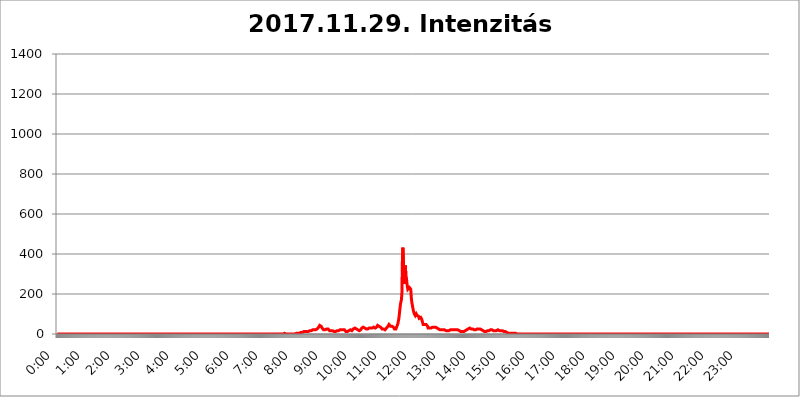
| Category | 2017.11.29. Intenzitás [W/m^2] |
|---|---|
| 0.0 | 0 |
| 0.0006944444444444445 | 0 |
| 0.001388888888888889 | 0 |
| 0.0020833333333333333 | 0 |
| 0.002777777777777778 | 0 |
| 0.003472222222222222 | 0 |
| 0.004166666666666667 | 0 |
| 0.004861111111111111 | 0 |
| 0.005555555555555556 | 0 |
| 0.0062499999999999995 | 0 |
| 0.006944444444444444 | 0 |
| 0.007638888888888889 | 0 |
| 0.008333333333333333 | 0 |
| 0.009027777777777779 | 0 |
| 0.009722222222222222 | 0 |
| 0.010416666666666666 | 0 |
| 0.011111111111111112 | 0 |
| 0.011805555555555555 | 0 |
| 0.012499999999999999 | 0 |
| 0.013194444444444444 | 0 |
| 0.013888888888888888 | 0 |
| 0.014583333333333332 | 0 |
| 0.015277777777777777 | 0 |
| 0.015972222222222224 | 0 |
| 0.016666666666666666 | 0 |
| 0.017361111111111112 | 0 |
| 0.018055555555555557 | 0 |
| 0.01875 | 0 |
| 0.019444444444444445 | 0 |
| 0.02013888888888889 | 0 |
| 0.020833333333333332 | 0 |
| 0.02152777777777778 | 0 |
| 0.022222222222222223 | 0 |
| 0.02291666666666667 | 0 |
| 0.02361111111111111 | 0 |
| 0.024305555555555556 | 0 |
| 0.024999999999999998 | 0 |
| 0.025694444444444447 | 0 |
| 0.02638888888888889 | 0 |
| 0.027083333333333334 | 0 |
| 0.027777777777777776 | 0 |
| 0.02847222222222222 | 0 |
| 0.029166666666666664 | 0 |
| 0.029861111111111113 | 0 |
| 0.030555555555555555 | 0 |
| 0.03125 | 0 |
| 0.03194444444444445 | 0 |
| 0.03263888888888889 | 0 |
| 0.03333333333333333 | 0 |
| 0.034027777777777775 | 0 |
| 0.034722222222222224 | 0 |
| 0.035416666666666666 | 0 |
| 0.036111111111111115 | 0 |
| 0.03680555555555556 | 0 |
| 0.0375 | 0 |
| 0.03819444444444444 | 0 |
| 0.03888888888888889 | 0 |
| 0.03958333333333333 | 0 |
| 0.04027777777777778 | 0 |
| 0.04097222222222222 | 0 |
| 0.041666666666666664 | 0 |
| 0.042361111111111106 | 0 |
| 0.04305555555555556 | 0 |
| 0.043750000000000004 | 0 |
| 0.044444444444444446 | 0 |
| 0.04513888888888889 | 0 |
| 0.04583333333333334 | 0 |
| 0.04652777777777778 | 0 |
| 0.04722222222222222 | 0 |
| 0.04791666666666666 | 0 |
| 0.04861111111111111 | 0 |
| 0.049305555555555554 | 0 |
| 0.049999999999999996 | 0 |
| 0.05069444444444445 | 0 |
| 0.051388888888888894 | 0 |
| 0.052083333333333336 | 0 |
| 0.05277777777777778 | 0 |
| 0.05347222222222222 | 0 |
| 0.05416666666666667 | 0 |
| 0.05486111111111111 | 0 |
| 0.05555555555555555 | 0 |
| 0.05625 | 0 |
| 0.05694444444444444 | 0 |
| 0.057638888888888885 | 0 |
| 0.05833333333333333 | 0 |
| 0.05902777777777778 | 0 |
| 0.059722222222222225 | 0 |
| 0.06041666666666667 | 0 |
| 0.061111111111111116 | 0 |
| 0.06180555555555556 | 0 |
| 0.0625 | 0 |
| 0.06319444444444444 | 0 |
| 0.06388888888888888 | 0 |
| 0.06458333333333334 | 0 |
| 0.06527777777777778 | 0 |
| 0.06597222222222222 | 0 |
| 0.06666666666666667 | 0 |
| 0.06736111111111111 | 0 |
| 0.06805555555555555 | 0 |
| 0.06874999999999999 | 0 |
| 0.06944444444444443 | 0 |
| 0.07013888888888889 | 0 |
| 0.07083333333333333 | 0 |
| 0.07152777777777779 | 0 |
| 0.07222222222222223 | 0 |
| 0.07291666666666667 | 0 |
| 0.07361111111111111 | 0 |
| 0.07430555555555556 | 0 |
| 0.075 | 0 |
| 0.07569444444444444 | 0 |
| 0.0763888888888889 | 0 |
| 0.07708333333333334 | 0 |
| 0.07777777777777778 | 0 |
| 0.07847222222222222 | 0 |
| 0.07916666666666666 | 0 |
| 0.0798611111111111 | 0 |
| 0.08055555555555556 | 0 |
| 0.08125 | 0 |
| 0.08194444444444444 | 0 |
| 0.08263888888888889 | 0 |
| 0.08333333333333333 | 0 |
| 0.08402777777777777 | 0 |
| 0.08472222222222221 | 0 |
| 0.08541666666666665 | 0 |
| 0.08611111111111112 | 0 |
| 0.08680555555555557 | 0 |
| 0.08750000000000001 | 0 |
| 0.08819444444444445 | 0 |
| 0.08888888888888889 | 0 |
| 0.08958333333333333 | 0 |
| 0.09027777777777778 | 0 |
| 0.09097222222222222 | 0 |
| 0.09166666666666667 | 0 |
| 0.09236111111111112 | 0 |
| 0.09305555555555556 | 0 |
| 0.09375 | 0 |
| 0.09444444444444444 | 0 |
| 0.09513888888888888 | 0 |
| 0.09583333333333333 | 0 |
| 0.09652777777777777 | 0 |
| 0.09722222222222222 | 0 |
| 0.09791666666666667 | 0 |
| 0.09861111111111111 | 0 |
| 0.09930555555555555 | 0 |
| 0.09999999999999999 | 0 |
| 0.10069444444444443 | 0 |
| 0.1013888888888889 | 0 |
| 0.10208333333333335 | 0 |
| 0.10277777777777779 | 0 |
| 0.10347222222222223 | 0 |
| 0.10416666666666667 | 0 |
| 0.10486111111111111 | 0 |
| 0.10555555555555556 | 0 |
| 0.10625 | 0 |
| 0.10694444444444444 | 0 |
| 0.1076388888888889 | 0 |
| 0.10833333333333334 | 0 |
| 0.10902777777777778 | 0 |
| 0.10972222222222222 | 0 |
| 0.1111111111111111 | 0 |
| 0.11180555555555556 | 0 |
| 0.11180555555555556 | 0 |
| 0.1125 | 0 |
| 0.11319444444444444 | 0 |
| 0.11388888888888889 | 0 |
| 0.11458333333333333 | 0 |
| 0.11527777777777777 | 0 |
| 0.11597222222222221 | 0 |
| 0.11666666666666665 | 0 |
| 0.1173611111111111 | 0 |
| 0.11805555555555557 | 0 |
| 0.11944444444444445 | 0 |
| 0.12013888888888889 | 0 |
| 0.12083333333333333 | 0 |
| 0.12152777777777778 | 0 |
| 0.12222222222222223 | 0 |
| 0.12291666666666667 | 0 |
| 0.12291666666666667 | 0 |
| 0.12361111111111112 | 0 |
| 0.12430555555555556 | 0 |
| 0.125 | 0 |
| 0.12569444444444444 | 0 |
| 0.12638888888888888 | 0 |
| 0.12708333333333333 | 0 |
| 0.16875 | 0 |
| 0.12847222222222224 | 0 |
| 0.12916666666666668 | 0 |
| 0.12986111111111112 | 0 |
| 0.13055555555555556 | 0 |
| 0.13125 | 0 |
| 0.13194444444444445 | 0 |
| 0.1326388888888889 | 0 |
| 0.13333333333333333 | 0 |
| 0.13402777777777777 | 0 |
| 0.13402777777777777 | 0 |
| 0.13472222222222222 | 0 |
| 0.13541666666666666 | 0 |
| 0.1361111111111111 | 0 |
| 0.13749999999999998 | 0 |
| 0.13819444444444443 | 0 |
| 0.1388888888888889 | 0 |
| 0.13958333333333334 | 0 |
| 0.14027777777777778 | 0 |
| 0.14097222222222222 | 0 |
| 0.14166666666666666 | 0 |
| 0.1423611111111111 | 0 |
| 0.14305555555555557 | 0 |
| 0.14375000000000002 | 0 |
| 0.14444444444444446 | 0 |
| 0.1451388888888889 | 0 |
| 0.1451388888888889 | 0 |
| 0.14652777777777778 | 0 |
| 0.14722222222222223 | 0 |
| 0.14791666666666667 | 0 |
| 0.1486111111111111 | 0 |
| 0.14930555555555555 | 0 |
| 0.15 | 0 |
| 0.15069444444444444 | 0 |
| 0.15138888888888888 | 0 |
| 0.15208333333333332 | 0 |
| 0.15277777777777776 | 0 |
| 0.15347222222222223 | 0 |
| 0.15416666666666667 | 0 |
| 0.15486111111111112 | 0 |
| 0.15555555555555556 | 0 |
| 0.15625 | 0 |
| 0.15694444444444444 | 0 |
| 0.15763888888888888 | 0 |
| 0.15833333333333333 | 0 |
| 0.15902777777777777 | 0 |
| 0.15972222222222224 | 0 |
| 0.16041666666666668 | 0 |
| 0.16111111111111112 | 0 |
| 0.16180555555555556 | 0 |
| 0.1625 | 0 |
| 0.16319444444444445 | 0 |
| 0.1638888888888889 | 0 |
| 0.16458333333333333 | 0 |
| 0.16527777777777777 | 0 |
| 0.16597222222222222 | 0 |
| 0.16666666666666666 | 0 |
| 0.1673611111111111 | 0 |
| 0.16805555555555554 | 0 |
| 0.16874999999999998 | 0 |
| 0.16944444444444443 | 0 |
| 0.17013888888888887 | 0 |
| 0.1708333333333333 | 0 |
| 0.17152777777777775 | 0 |
| 0.17222222222222225 | 0 |
| 0.1729166666666667 | 0 |
| 0.17361111111111113 | 0 |
| 0.17430555555555557 | 0 |
| 0.17500000000000002 | 0 |
| 0.17569444444444446 | 0 |
| 0.1763888888888889 | 0 |
| 0.17708333333333334 | 0 |
| 0.17777777777777778 | 0 |
| 0.17847222222222223 | 0 |
| 0.17916666666666667 | 0 |
| 0.1798611111111111 | 0 |
| 0.18055555555555555 | 0 |
| 0.18125 | 0 |
| 0.18194444444444444 | 0 |
| 0.1826388888888889 | 0 |
| 0.18333333333333335 | 0 |
| 0.1840277777777778 | 0 |
| 0.18472222222222223 | 0 |
| 0.18541666666666667 | 0 |
| 0.18611111111111112 | 0 |
| 0.18680555555555556 | 0 |
| 0.1875 | 0 |
| 0.18819444444444444 | 0 |
| 0.18888888888888888 | 0 |
| 0.18958333333333333 | 0 |
| 0.19027777777777777 | 0 |
| 0.1909722222222222 | 0 |
| 0.19166666666666665 | 0 |
| 0.19236111111111112 | 0 |
| 0.19305555555555554 | 0 |
| 0.19375 | 0 |
| 0.19444444444444445 | 0 |
| 0.1951388888888889 | 0 |
| 0.19583333333333333 | 0 |
| 0.19652777777777777 | 0 |
| 0.19722222222222222 | 0 |
| 0.19791666666666666 | 0 |
| 0.1986111111111111 | 0 |
| 0.19930555555555554 | 0 |
| 0.19999999999999998 | 0 |
| 0.20069444444444443 | 0 |
| 0.20138888888888887 | 0 |
| 0.2020833333333333 | 0 |
| 0.2027777777777778 | 0 |
| 0.2034722222222222 | 0 |
| 0.2041666666666667 | 0 |
| 0.20486111111111113 | 0 |
| 0.20555555555555557 | 0 |
| 0.20625000000000002 | 0 |
| 0.20694444444444446 | 0 |
| 0.2076388888888889 | 0 |
| 0.20833333333333334 | 0 |
| 0.20902777777777778 | 0 |
| 0.20972222222222223 | 0 |
| 0.21041666666666667 | 0 |
| 0.2111111111111111 | 0 |
| 0.21180555555555555 | 0 |
| 0.2125 | 0 |
| 0.21319444444444444 | 0 |
| 0.2138888888888889 | 0 |
| 0.21458333333333335 | 0 |
| 0.2152777777777778 | 0 |
| 0.21597222222222223 | 0 |
| 0.21666666666666667 | 0 |
| 0.21736111111111112 | 0 |
| 0.21805555555555556 | 0 |
| 0.21875 | 0 |
| 0.21944444444444444 | 0 |
| 0.22013888888888888 | 0 |
| 0.22083333333333333 | 0 |
| 0.22152777777777777 | 0 |
| 0.2222222222222222 | 0 |
| 0.22291666666666665 | 0 |
| 0.2236111111111111 | 0 |
| 0.22430555555555556 | 0 |
| 0.225 | 0 |
| 0.22569444444444445 | 0 |
| 0.2263888888888889 | 0 |
| 0.22708333333333333 | 0 |
| 0.22777777777777777 | 0 |
| 0.22847222222222222 | 0 |
| 0.22916666666666666 | 0 |
| 0.2298611111111111 | 0 |
| 0.23055555555555554 | 0 |
| 0.23124999999999998 | 0 |
| 0.23194444444444443 | 0 |
| 0.23263888888888887 | 0 |
| 0.2333333333333333 | 0 |
| 0.2340277777777778 | 0 |
| 0.2347222222222222 | 0 |
| 0.2354166666666667 | 0 |
| 0.23611111111111113 | 0 |
| 0.23680555555555557 | 0 |
| 0.23750000000000002 | 0 |
| 0.23819444444444446 | 0 |
| 0.2388888888888889 | 0 |
| 0.23958333333333334 | 0 |
| 0.24027777777777778 | 0 |
| 0.24097222222222223 | 0 |
| 0.24166666666666667 | 0 |
| 0.2423611111111111 | 0 |
| 0.24305555555555555 | 0 |
| 0.24375 | 0 |
| 0.24444444444444446 | 0 |
| 0.24513888888888888 | 0 |
| 0.24583333333333335 | 0 |
| 0.2465277777777778 | 0 |
| 0.24722222222222223 | 0 |
| 0.24791666666666667 | 0 |
| 0.24861111111111112 | 0 |
| 0.24930555555555556 | 0 |
| 0.25 | 0 |
| 0.25069444444444444 | 0 |
| 0.2513888888888889 | 0 |
| 0.2520833333333333 | 0 |
| 0.25277777777777777 | 0 |
| 0.2534722222222222 | 0 |
| 0.25416666666666665 | 0 |
| 0.2548611111111111 | 0 |
| 0.2555555555555556 | 0 |
| 0.25625000000000003 | 0 |
| 0.2569444444444445 | 0 |
| 0.2576388888888889 | 0 |
| 0.25833333333333336 | 0 |
| 0.2590277777777778 | 0 |
| 0.25972222222222224 | 0 |
| 0.2604166666666667 | 0 |
| 0.2611111111111111 | 0 |
| 0.26180555555555557 | 0 |
| 0.2625 | 0 |
| 0.26319444444444445 | 0 |
| 0.2638888888888889 | 0 |
| 0.26458333333333334 | 0 |
| 0.2652777777777778 | 0 |
| 0.2659722222222222 | 0 |
| 0.26666666666666666 | 0 |
| 0.2673611111111111 | 0 |
| 0.26805555555555555 | 0 |
| 0.26875 | 0 |
| 0.26944444444444443 | 0 |
| 0.2701388888888889 | 0 |
| 0.2708333333333333 | 0 |
| 0.27152777777777776 | 0 |
| 0.2722222222222222 | 0 |
| 0.27291666666666664 | 0 |
| 0.2736111111111111 | 0 |
| 0.2743055555555555 | 0 |
| 0.27499999999999997 | 0 |
| 0.27569444444444446 | 0 |
| 0.27638888888888885 | 0 |
| 0.27708333333333335 | 0 |
| 0.2777777777777778 | 0 |
| 0.27847222222222223 | 0 |
| 0.2791666666666667 | 0 |
| 0.2798611111111111 | 0 |
| 0.28055555555555556 | 0 |
| 0.28125 | 0 |
| 0.28194444444444444 | 0 |
| 0.2826388888888889 | 0 |
| 0.2833333333333333 | 0 |
| 0.28402777777777777 | 0 |
| 0.2847222222222222 | 0 |
| 0.28541666666666665 | 0 |
| 0.28611111111111115 | 0 |
| 0.28680555555555554 | 0 |
| 0.28750000000000003 | 0 |
| 0.2881944444444445 | 0 |
| 0.2888888888888889 | 0 |
| 0.28958333333333336 | 0 |
| 0.2902777777777778 | 0 |
| 0.29097222222222224 | 0 |
| 0.2916666666666667 | 0 |
| 0.2923611111111111 | 0 |
| 0.29305555555555557 | 0 |
| 0.29375 | 0 |
| 0.29444444444444445 | 0 |
| 0.2951388888888889 | 0 |
| 0.29583333333333334 | 0 |
| 0.2965277777777778 | 0 |
| 0.2972222222222222 | 0 |
| 0.29791666666666666 | 0 |
| 0.2986111111111111 | 0 |
| 0.29930555555555555 | 0 |
| 0.3 | 0 |
| 0.30069444444444443 | 0 |
| 0.3013888888888889 | 0 |
| 0.3020833333333333 | 0 |
| 0.30277777777777776 | 0 |
| 0.3034722222222222 | 0 |
| 0.30416666666666664 | 0 |
| 0.3048611111111111 | 0 |
| 0.3055555555555555 | 0 |
| 0.30624999999999997 | 0 |
| 0.3069444444444444 | 0 |
| 0.3076388888888889 | 0 |
| 0.30833333333333335 | 0 |
| 0.3090277777777778 | 0 |
| 0.30972222222222223 | 0 |
| 0.3104166666666667 | 0 |
| 0.3111111111111111 | 0 |
| 0.31180555555555556 | 3.525 |
| 0.3125 | 0 |
| 0.31319444444444444 | 0 |
| 0.3138888888888889 | 0 |
| 0.3145833333333333 | 0 |
| 0.31527777777777777 | 0 |
| 0.3159722222222222 | 0 |
| 0.31666666666666665 | 0 |
| 0.31736111111111115 | 3.525 |
| 0.31805555555555554 | 3.525 |
| 0.31875000000000003 | 3.525 |
| 0.3194444444444445 | 3.525 |
| 0.3201388888888889 | 0 |
| 0.32083333333333336 | 0 |
| 0.3215277777777778 | 0 |
| 0.32222222222222224 | 3.525 |
| 0.3229166666666667 | 0 |
| 0.3236111111111111 | 3.525 |
| 0.32430555555555557 | 0 |
| 0.325 | 0 |
| 0.32569444444444445 | 0 |
| 0.3263888888888889 | 0 |
| 0.32708333333333334 | 0 |
| 0.3277777777777778 | 0 |
| 0.3284722222222222 | 0 |
| 0.32916666666666666 | 0 |
| 0.3298611111111111 | 0 |
| 0.33055555555555555 | 0 |
| 0.33125 | 0 |
| 0.33194444444444443 | 0 |
| 0.3326388888888889 | 0 |
| 0.3333333333333333 | 0 |
| 0.3340277777777778 | 0 |
| 0.3347222222222222 | 3.525 |
| 0.3354166666666667 | 3.525 |
| 0.3361111111111111 | 3.525 |
| 0.3368055555555556 | 3.525 |
| 0.33749999999999997 | 3.525 |
| 0.33819444444444446 | 3.525 |
| 0.33888888888888885 | 3.525 |
| 0.33958333333333335 | 3.525 |
| 0.34027777777777773 | 7.887 |
| 0.34097222222222223 | 7.887 |
| 0.3416666666666666 | 7.887 |
| 0.3423611111111111 | 7.887 |
| 0.3430555555555555 | 12.257 |
| 0.34375 | 7.887 |
| 0.3444444444444445 | 12.257 |
| 0.3451388888888889 | 12.257 |
| 0.3458333333333334 | 12.257 |
| 0.34652777777777777 | 12.257 |
| 0.34722222222222227 | 16.636 |
| 0.34791666666666665 | 12.257 |
| 0.34861111111111115 | 12.257 |
| 0.34930555555555554 | 12.257 |
| 0.35000000000000003 | 12.257 |
| 0.3506944444444444 | 12.257 |
| 0.3513888888888889 | 12.257 |
| 0.3520833333333333 | 12.257 |
| 0.3527777777777778 | 12.257 |
| 0.3534722222222222 | 16.636 |
| 0.3541666666666667 | 16.636 |
| 0.3548611111111111 | 16.636 |
| 0.35555555555555557 | 16.636 |
| 0.35625 | 16.636 |
| 0.35694444444444445 | 21.024 |
| 0.3576388888888889 | 21.024 |
| 0.35833333333333334 | 21.024 |
| 0.3590277777777778 | 21.024 |
| 0.3597222222222222 | 21.024 |
| 0.36041666666666666 | 21.024 |
| 0.3611111111111111 | 21.024 |
| 0.36180555555555555 | 21.024 |
| 0.3625 | 21.024 |
| 0.36319444444444443 | 21.024 |
| 0.3638888888888889 | 21.024 |
| 0.3645833333333333 | 25.419 |
| 0.3652777777777778 | 25.419 |
| 0.3659722222222222 | 29.823 |
| 0.3666666666666667 | 34.234 |
| 0.3673611111111111 | 38.653 |
| 0.3680555555555556 | 43.079 |
| 0.36874999999999997 | 43.079 |
| 0.36944444444444446 | 43.079 |
| 0.37013888888888885 | 38.653 |
| 0.37083333333333335 | 34.234 |
| 0.37152777777777773 | 29.823 |
| 0.37222222222222223 | 29.823 |
| 0.3729166666666666 | 25.419 |
| 0.3736111111111111 | 21.024 |
| 0.3743055555555555 | 21.024 |
| 0.375 | 21.024 |
| 0.3756944444444445 | 21.024 |
| 0.3763888888888889 | 25.419 |
| 0.3770833333333334 | 21.024 |
| 0.37777777777777777 | 25.419 |
| 0.37847222222222227 | 25.419 |
| 0.37916666666666665 | 25.419 |
| 0.37986111111111115 | 25.419 |
| 0.38055555555555554 | 21.024 |
| 0.38125000000000003 | 21.024 |
| 0.3819444444444444 | 16.636 |
| 0.3826388888888889 | 16.636 |
| 0.3833333333333333 | 16.636 |
| 0.3840277777777778 | 16.636 |
| 0.3847222222222222 | 16.636 |
| 0.3854166666666667 | 16.636 |
| 0.3861111111111111 | 16.636 |
| 0.38680555555555557 | 16.636 |
| 0.3875 | 12.257 |
| 0.38819444444444445 | 12.257 |
| 0.3888888888888889 | 12.257 |
| 0.38958333333333334 | 12.257 |
| 0.3902777777777778 | 12.257 |
| 0.3909722222222222 | 12.257 |
| 0.39166666666666666 | 12.257 |
| 0.3923611111111111 | 16.636 |
| 0.39305555555555555 | 16.636 |
| 0.39375 | 16.636 |
| 0.39444444444444443 | 16.636 |
| 0.3951388888888889 | 21.024 |
| 0.3958333333333333 | 21.024 |
| 0.3965277777777778 | 21.024 |
| 0.3972222222222222 | 21.024 |
| 0.3979166666666667 | 21.024 |
| 0.3986111111111111 | 21.024 |
| 0.3993055555555556 | 21.024 |
| 0.39999999999999997 | 21.024 |
| 0.40069444444444446 | 21.024 |
| 0.40138888888888885 | 21.024 |
| 0.40208333333333335 | 21.024 |
| 0.40277777777777773 | 21.024 |
| 0.40347222222222223 | 16.636 |
| 0.4041666666666666 | 16.636 |
| 0.4048611111111111 | 12.257 |
| 0.4055555555555555 | 12.257 |
| 0.40625 | 12.257 |
| 0.4069444444444445 | 12.257 |
| 0.4076388888888889 | 12.257 |
| 0.4083333333333334 | 16.636 |
| 0.40902777777777777 | 16.636 |
| 0.40972222222222227 | 16.636 |
| 0.41041666666666665 | 16.636 |
| 0.41111111111111115 | 21.024 |
| 0.41180555555555554 | 16.636 |
| 0.41250000000000003 | 16.636 |
| 0.4131944444444444 | 16.636 |
| 0.4138888888888889 | 21.024 |
| 0.4145833333333333 | 21.024 |
| 0.4152777777777778 | 25.419 |
| 0.4159722222222222 | 25.419 |
| 0.4166666666666667 | 25.419 |
| 0.4173611111111111 | 29.823 |
| 0.41805555555555557 | 29.823 |
| 0.41875 | 25.419 |
| 0.41944444444444445 | 25.419 |
| 0.4201388888888889 | 21.024 |
| 0.42083333333333334 | 21.024 |
| 0.4215277777777778 | 21.024 |
| 0.4222222222222222 | 21.024 |
| 0.42291666666666666 | 21.024 |
| 0.4236111111111111 | 16.636 |
| 0.42430555555555555 | 16.636 |
| 0.425 | 21.024 |
| 0.42569444444444443 | 21.024 |
| 0.4263888888888889 | 25.419 |
| 0.4270833333333333 | 29.823 |
| 0.4277777777777778 | 29.823 |
| 0.4284722222222222 | 34.234 |
| 0.4291666666666667 | 34.234 |
| 0.4298611111111111 | 34.234 |
| 0.4305555555555556 | 34.234 |
| 0.43124999999999997 | 29.823 |
| 0.43194444444444446 | 25.419 |
| 0.43263888888888885 | 25.419 |
| 0.43333333333333335 | 25.419 |
| 0.43402777777777773 | 25.419 |
| 0.43472222222222223 | 25.419 |
| 0.4354166666666666 | 25.419 |
| 0.4361111111111111 | 25.419 |
| 0.4368055555555555 | 29.823 |
| 0.4375 | 29.823 |
| 0.4381944444444445 | 29.823 |
| 0.4388888888888889 | 29.823 |
| 0.4395833333333334 | 29.823 |
| 0.44027777777777777 | 29.823 |
| 0.44097222222222227 | 29.823 |
| 0.44166666666666665 | 29.823 |
| 0.44236111111111115 | 34.234 |
| 0.44305555555555554 | 34.234 |
| 0.44375000000000003 | 34.234 |
| 0.4444444444444444 | 34.234 |
| 0.4451388888888889 | 34.234 |
| 0.4458333333333333 | 29.823 |
| 0.4465277777777778 | 34.234 |
| 0.4472222222222222 | 34.234 |
| 0.4479166666666667 | 34.234 |
| 0.4486111111111111 | 38.653 |
| 0.44930555555555557 | 43.079 |
| 0.45 | 43.079 |
| 0.45069444444444445 | 38.653 |
| 0.4513888888888889 | 38.653 |
| 0.45208333333333334 | 38.653 |
| 0.4527777777777778 | 38.653 |
| 0.4534722222222222 | 34.234 |
| 0.45416666666666666 | 29.823 |
| 0.4548611111111111 | 29.823 |
| 0.45555555555555555 | 25.419 |
| 0.45625 | 25.419 |
| 0.45694444444444443 | 25.419 |
| 0.4576388888888889 | 25.419 |
| 0.4583333333333333 | 21.024 |
| 0.4590277777777778 | 21.024 |
| 0.4597222222222222 | 21.024 |
| 0.4604166666666667 | 25.419 |
| 0.4611111111111111 | 25.419 |
| 0.4618055555555556 | 29.823 |
| 0.46249999999999997 | 29.823 |
| 0.46319444444444446 | 34.234 |
| 0.46388888888888885 | 38.653 |
| 0.46458333333333335 | 43.079 |
| 0.46527777777777773 | 47.511 |
| 0.46597222222222223 | 43.079 |
| 0.4666666666666666 | 43.079 |
| 0.4673611111111111 | 38.653 |
| 0.4680555555555555 | 38.653 |
| 0.46875 | 38.653 |
| 0.4694444444444445 | 38.653 |
| 0.4701388888888889 | 38.653 |
| 0.4708333333333334 | 38.653 |
| 0.47152777777777777 | 34.234 |
| 0.47222222222222227 | 29.823 |
| 0.47291666666666665 | 25.419 |
| 0.47361111111111115 | 21.024 |
| 0.47430555555555554 | 21.024 |
| 0.47500000000000003 | 25.419 |
| 0.4756944444444444 | 29.823 |
| 0.4763888888888889 | 38.653 |
| 0.4770833333333333 | 43.079 |
| 0.4777777777777778 | 51.951 |
| 0.4784722222222222 | 65.31 |
| 0.4791666666666667 | 78.722 |
| 0.4798611111111111 | 101.184 |
| 0.48055555555555557 | 123.758 |
| 0.48125 | 146.423 |
| 0.48194444444444445 | 160.056 |
| 0.4826388888888889 | 169.156 |
| 0.48333333333333334 | 201.058 |
| 0.4840277777777778 | 360.221 |
| 0.4847222222222222 | 431.833 |
| 0.48541666666666666 | 427.39 |
| 0.4861111111111111 | 301.354 |
| 0.48680555555555555 | 251.251 |
| 0.4875 | 251.251 |
| 0.48819444444444443 | 342.162 |
| 0.4888888888888889 | 296.808 |
| 0.4895833333333333 | 283.156 |
| 0.4902777777777778 | 260.373 |
| 0.4909722222222222 | 237.564 |
| 0.4916666666666667 | 223.873 |
| 0.4923611111111111 | 219.309 |
| 0.4930555555555556 | 223.873 |
| 0.49374999999999997 | 233 |
| 0.49444444444444446 | 237.564 |
| 0.49513888888888885 | 237.564 |
| 0.49583333333333335 | 223.873 |
| 0.49652777777777773 | 182.82 |
| 0.49722222222222223 | 160.056 |
| 0.4979166666666666 | 155.509 |
| 0.4986111111111111 | 132.814 |
| 0.4993055555555555 | 119.235 |
| 0.5 | 110.201 |
| 0.5006944444444444 | 101.184 |
| 0.5013888888888889 | 96.682 |
| 0.5020833333333333 | 92.184 |
| 0.5027777777777778 | 92.184 |
| 0.5034722222222222 | 101.184 |
| 0.5041666666666667 | 96.682 |
| 0.5048611111111111 | 92.184 |
| 0.5055555555555555 | 92.184 |
| 0.50625 | 92.184 |
| 0.5069444444444444 | 87.692 |
| 0.5076388888888889 | 78.722 |
| 0.5083333333333333 | 78.722 |
| 0.5090277777777777 | 83.205 |
| 0.5097222222222222 | 83.205 |
| 0.5104166666666666 | 78.722 |
| 0.5111111111111112 | 74.246 |
| 0.5118055555555555 | 65.31 |
| 0.5125000000000001 | 56.398 |
| 0.5131944444444444 | 47.511 |
| 0.513888888888889 | 43.079 |
| 0.5145833333333333 | 47.511 |
| 0.5152777777777778 | 47.511 |
| 0.5159722222222222 | 47.511 |
| 0.5166666666666667 | 47.511 |
| 0.517361111111111 | 47.511 |
| 0.5180555555555556 | 47.511 |
| 0.5187499999999999 | 43.079 |
| 0.5194444444444445 | 38.653 |
| 0.5201388888888888 | 29.823 |
| 0.5208333333333334 | 29.823 |
| 0.5215277777777778 | 29.823 |
| 0.5222222222222223 | 29.823 |
| 0.5229166666666667 | 29.823 |
| 0.5236111111111111 | 29.823 |
| 0.5243055555555556 | 29.823 |
| 0.525 | 29.823 |
| 0.5256944444444445 | 34.234 |
| 0.5263888888888889 | 34.234 |
| 0.5270833333333333 | 34.234 |
| 0.5277777777777778 | 34.234 |
| 0.5284722222222222 | 34.234 |
| 0.5291666666666667 | 34.234 |
| 0.5298611111111111 | 34.234 |
| 0.5305555555555556 | 34.234 |
| 0.53125 | 29.823 |
| 0.5319444444444444 | 29.823 |
| 0.5326388888888889 | 29.823 |
| 0.5333333333333333 | 29.823 |
| 0.5340277777777778 | 29.823 |
| 0.5347222222222222 | 25.419 |
| 0.5354166666666667 | 25.419 |
| 0.5361111111111111 | 25.419 |
| 0.5368055555555555 | 21.024 |
| 0.5375 | 21.024 |
| 0.5381944444444444 | 21.024 |
| 0.5388888888888889 | 21.024 |
| 0.5395833333333333 | 21.024 |
| 0.5402777777777777 | 21.024 |
| 0.5409722222222222 | 21.024 |
| 0.5416666666666666 | 21.024 |
| 0.5423611111111112 | 21.024 |
| 0.5430555555555555 | 21.024 |
| 0.5437500000000001 | 16.636 |
| 0.5444444444444444 | 16.636 |
| 0.545138888888889 | 16.636 |
| 0.5458333333333333 | 16.636 |
| 0.5465277777777778 | 16.636 |
| 0.5472222222222222 | 16.636 |
| 0.5479166666666667 | 16.636 |
| 0.548611111111111 | 16.636 |
| 0.5493055555555556 | 16.636 |
| 0.5499999999999999 | 21.024 |
| 0.5506944444444445 | 21.024 |
| 0.5513888888888888 | 21.024 |
| 0.5520833333333334 | 21.024 |
| 0.5527777777777778 | 21.024 |
| 0.5534722222222223 | 21.024 |
| 0.5541666666666667 | 21.024 |
| 0.5548611111111111 | 21.024 |
| 0.5555555555555556 | 21.024 |
| 0.55625 | 21.024 |
| 0.5569444444444445 | 21.024 |
| 0.5576388888888889 | 21.024 |
| 0.5583333333333333 | 21.024 |
| 0.5590277777777778 | 21.024 |
| 0.5597222222222222 | 21.024 |
| 0.5604166666666667 | 21.024 |
| 0.5611111111111111 | 21.024 |
| 0.5618055555555556 | 21.024 |
| 0.5625 | 21.024 |
| 0.5631944444444444 | 16.636 |
| 0.5638888888888889 | 16.636 |
| 0.5645833333333333 | 16.636 |
| 0.5652777777777778 | 12.257 |
| 0.5659722222222222 | 12.257 |
| 0.5666666666666667 | 12.257 |
| 0.5673611111111111 | 12.257 |
| 0.5680555555555555 | 12.257 |
| 0.56875 | 12.257 |
| 0.5694444444444444 | 12.257 |
| 0.5701388888888889 | 12.257 |
| 0.5708333333333333 | 12.257 |
| 0.5715277777777777 | 12.257 |
| 0.5722222222222222 | 16.636 |
| 0.5729166666666666 | 16.636 |
| 0.5736111111111112 | 21.024 |
| 0.5743055555555555 | 21.024 |
| 0.5750000000000001 | 21.024 |
| 0.5756944444444444 | 25.419 |
| 0.576388888888889 | 25.419 |
| 0.5770833333333333 | 29.823 |
| 0.5777777777777778 | 29.823 |
| 0.5784722222222222 | 29.823 |
| 0.5791666666666667 | 29.823 |
| 0.579861111111111 | 25.419 |
| 0.5805555555555556 | 25.419 |
| 0.5812499999999999 | 25.419 |
| 0.5819444444444445 | 25.419 |
| 0.5826388888888888 | 25.419 |
| 0.5833333333333334 | 21.024 |
| 0.5840277777777778 | 25.419 |
| 0.5847222222222223 | 21.024 |
| 0.5854166666666667 | 21.024 |
| 0.5861111111111111 | 21.024 |
| 0.5868055555555556 | 21.024 |
| 0.5875 | 25.419 |
| 0.5881944444444445 | 25.419 |
| 0.5888888888888889 | 25.419 |
| 0.5895833333333333 | 25.419 |
| 0.5902777777777778 | 25.419 |
| 0.5909722222222222 | 25.419 |
| 0.5916666666666667 | 25.419 |
| 0.5923611111111111 | 25.419 |
| 0.5930555555555556 | 25.419 |
| 0.59375 | 25.419 |
| 0.5944444444444444 | 25.419 |
| 0.5951388888888889 | 21.024 |
| 0.5958333333333333 | 21.024 |
| 0.5965277777777778 | 21.024 |
| 0.5972222222222222 | 16.636 |
| 0.5979166666666667 | 16.636 |
| 0.5986111111111111 | 16.636 |
| 0.5993055555555555 | 12.257 |
| 0.6 | 12.257 |
| 0.6006944444444444 | 12.257 |
| 0.6013888888888889 | 12.257 |
| 0.6020833333333333 | 12.257 |
| 0.6027777777777777 | 12.257 |
| 0.6034722222222222 | 16.636 |
| 0.6041666666666666 | 16.636 |
| 0.6048611111111112 | 16.636 |
| 0.6055555555555555 | 16.636 |
| 0.6062500000000001 | 21.024 |
| 0.6069444444444444 | 21.024 |
| 0.607638888888889 | 21.024 |
| 0.6083333333333333 | 21.024 |
| 0.6090277777777778 | 21.024 |
| 0.6097222222222222 | 21.024 |
| 0.6104166666666667 | 21.024 |
| 0.611111111111111 | 16.636 |
| 0.6118055555555556 | 16.636 |
| 0.6124999999999999 | 16.636 |
| 0.6131944444444445 | 16.636 |
| 0.6138888888888888 | 16.636 |
| 0.6145833333333334 | 16.636 |
| 0.6152777777777778 | 16.636 |
| 0.6159722222222223 | 16.636 |
| 0.6166666666666667 | 21.024 |
| 0.6173611111111111 | 21.024 |
| 0.6180555555555556 | 21.024 |
| 0.61875 | 21.024 |
| 0.6194444444444445 | 21.024 |
| 0.6201388888888889 | 16.636 |
| 0.6208333333333333 | 16.636 |
| 0.6215277777777778 | 16.636 |
| 0.6222222222222222 | 16.636 |
| 0.6229166666666667 | 16.636 |
| 0.6236111111111111 | 12.257 |
| 0.6243055555555556 | 16.636 |
| 0.625 | 12.257 |
| 0.6256944444444444 | 12.257 |
| 0.6263888888888889 | 12.257 |
| 0.6270833333333333 | 12.257 |
| 0.6277777777777778 | 12.257 |
| 0.6284722222222222 | 12.257 |
| 0.6291666666666667 | 7.887 |
| 0.6298611111111111 | 7.887 |
| 0.6305555555555555 | 7.887 |
| 0.63125 | 3.525 |
| 0.6319444444444444 | 3.525 |
| 0.6326388888888889 | 3.525 |
| 0.6333333333333333 | 3.525 |
| 0.6340277777777777 | 3.525 |
| 0.6347222222222222 | 3.525 |
| 0.6354166666666666 | 3.525 |
| 0.6361111111111112 | 3.525 |
| 0.6368055555555555 | 3.525 |
| 0.6375000000000001 | 3.525 |
| 0.6381944444444444 | 3.525 |
| 0.638888888888889 | 3.525 |
| 0.6395833333333333 | 3.525 |
| 0.6402777777777778 | 3.525 |
| 0.6409722222222222 | 3.525 |
| 0.6416666666666667 | 3.525 |
| 0.642361111111111 | 3.525 |
| 0.6430555555555556 | 3.525 |
| 0.6437499999999999 | 0 |
| 0.6444444444444445 | 0 |
| 0.6451388888888888 | 0 |
| 0.6458333333333334 | 0 |
| 0.6465277777777778 | 0 |
| 0.6472222222222223 | 0 |
| 0.6479166666666667 | 0 |
| 0.6486111111111111 | 0 |
| 0.6493055555555556 | 0 |
| 0.65 | 0 |
| 0.6506944444444445 | 0 |
| 0.6513888888888889 | 0 |
| 0.6520833333333333 | 0 |
| 0.6527777777777778 | 0 |
| 0.6534722222222222 | 0 |
| 0.6541666666666667 | 0 |
| 0.6548611111111111 | 0 |
| 0.6555555555555556 | 0 |
| 0.65625 | 0 |
| 0.6569444444444444 | 0 |
| 0.6576388888888889 | 0 |
| 0.6583333333333333 | 0 |
| 0.6590277777777778 | 0 |
| 0.6597222222222222 | 0 |
| 0.6604166666666667 | 0 |
| 0.6611111111111111 | 0 |
| 0.6618055555555555 | 0 |
| 0.6625 | 0 |
| 0.6631944444444444 | 0 |
| 0.6638888888888889 | 0 |
| 0.6645833333333333 | 0 |
| 0.6652777777777777 | 0 |
| 0.6659722222222222 | 0 |
| 0.6666666666666666 | 0 |
| 0.6673611111111111 | 0 |
| 0.6680555555555556 | 0 |
| 0.6687500000000001 | 0 |
| 0.6694444444444444 | 0 |
| 0.6701388888888888 | 0 |
| 0.6708333333333334 | 0 |
| 0.6715277777777778 | 0 |
| 0.6722222222222222 | 0 |
| 0.6729166666666666 | 0 |
| 0.6736111111111112 | 0 |
| 0.6743055555555556 | 0 |
| 0.6749999999999999 | 0 |
| 0.6756944444444444 | 0 |
| 0.6763888888888889 | 0 |
| 0.6770833333333334 | 0 |
| 0.6777777777777777 | 0 |
| 0.6784722222222223 | 0 |
| 0.6791666666666667 | 0 |
| 0.6798611111111111 | 0 |
| 0.6805555555555555 | 0 |
| 0.68125 | 0 |
| 0.6819444444444445 | 0 |
| 0.6826388888888889 | 0 |
| 0.6833333333333332 | 0 |
| 0.6840277777777778 | 0 |
| 0.6847222222222222 | 0 |
| 0.6854166666666667 | 0 |
| 0.686111111111111 | 0 |
| 0.6868055555555556 | 0 |
| 0.6875 | 0 |
| 0.6881944444444444 | 0 |
| 0.688888888888889 | 0 |
| 0.6895833333333333 | 0 |
| 0.6902777777777778 | 0 |
| 0.6909722222222222 | 0 |
| 0.6916666666666668 | 0 |
| 0.6923611111111111 | 0 |
| 0.6930555555555555 | 0 |
| 0.69375 | 0 |
| 0.6944444444444445 | 0 |
| 0.6951388888888889 | 0 |
| 0.6958333333333333 | 0 |
| 0.6965277777777777 | 0 |
| 0.6972222222222223 | 0 |
| 0.6979166666666666 | 0 |
| 0.6986111111111111 | 0 |
| 0.6993055555555556 | 0 |
| 0.7000000000000001 | 0 |
| 0.7006944444444444 | 0 |
| 0.7013888888888888 | 0 |
| 0.7020833333333334 | 0 |
| 0.7027777777777778 | 0 |
| 0.7034722222222222 | 0 |
| 0.7041666666666666 | 0 |
| 0.7048611111111112 | 0 |
| 0.7055555555555556 | 0 |
| 0.7062499999999999 | 0 |
| 0.7069444444444444 | 0 |
| 0.7076388888888889 | 0 |
| 0.7083333333333334 | 0 |
| 0.7090277777777777 | 0 |
| 0.7097222222222223 | 0 |
| 0.7104166666666667 | 0 |
| 0.7111111111111111 | 0 |
| 0.7118055555555555 | 0 |
| 0.7125 | 0 |
| 0.7131944444444445 | 0 |
| 0.7138888888888889 | 0 |
| 0.7145833333333332 | 0 |
| 0.7152777777777778 | 0 |
| 0.7159722222222222 | 0 |
| 0.7166666666666667 | 0 |
| 0.717361111111111 | 0 |
| 0.7180555555555556 | 0 |
| 0.71875 | 0 |
| 0.7194444444444444 | 0 |
| 0.720138888888889 | 0 |
| 0.7208333333333333 | 0 |
| 0.7215277777777778 | 0 |
| 0.7222222222222222 | 0 |
| 0.7229166666666668 | 0 |
| 0.7236111111111111 | 0 |
| 0.7243055555555555 | 0 |
| 0.725 | 0 |
| 0.7256944444444445 | 0 |
| 0.7263888888888889 | 0 |
| 0.7270833333333333 | 0 |
| 0.7277777777777777 | 0 |
| 0.7284722222222223 | 0 |
| 0.7291666666666666 | 0 |
| 0.7298611111111111 | 0 |
| 0.7305555555555556 | 0 |
| 0.7312500000000001 | 0 |
| 0.7319444444444444 | 0 |
| 0.7326388888888888 | 0 |
| 0.7333333333333334 | 0 |
| 0.7340277777777778 | 0 |
| 0.7347222222222222 | 0 |
| 0.7354166666666666 | 0 |
| 0.7361111111111112 | 0 |
| 0.7368055555555556 | 0 |
| 0.7374999999999999 | 0 |
| 0.7381944444444444 | 0 |
| 0.7388888888888889 | 0 |
| 0.7395833333333334 | 0 |
| 0.7402777777777777 | 0 |
| 0.7409722222222223 | 0 |
| 0.7416666666666667 | 0 |
| 0.7423611111111111 | 0 |
| 0.7430555555555555 | 0 |
| 0.74375 | 0 |
| 0.7444444444444445 | 0 |
| 0.7451388888888889 | 0 |
| 0.7458333333333332 | 0 |
| 0.7465277777777778 | 0 |
| 0.7472222222222222 | 0 |
| 0.7479166666666667 | 0 |
| 0.748611111111111 | 0 |
| 0.7493055555555556 | 0 |
| 0.75 | 0 |
| 0.7506944444444444 | 0 |
| 0.751388888888889 | 0 |
| 0.7520833333333333 | 0 |
| 0.7527777777777778 | 0 |
| 0.7534722222222222 | 0 |
| 0.7541666666666668 | 0 |
| 0.7548611111111111 | 0 |
| 0.7555555555555555 | 0 |
| 0.75625 | 0 |
| 0.7569444444444445 | 0 |
| 0.7576388888888889 | 0 |
| 0.7583333333333333 | 0 |
| 0.7590277777777777 | 0 |
| 0.7597222222222223 | 0 |
| 0.7604166666666666 | 0 |
| 0.7611111111111111 | 0 |
| 0.7618055555555556 | 0 |
| 0.7625000000000001 | 0 |
| 0.7631944444444444 | 0 |
| 0.7638888888888888 | 0 |
| 0.7645833333333334 | 0 |
| 0.7652777777777778 | 0 |
| 0.7659722222222222 | 0 |
| 0.7666666666666666 | 0 |
| 0.7673611111111112 | 0 |
| 0.7680555555555556 | 0 |
| 0.7687499999999999 | 0 |
| 0.7694444444444444 | 0 |
| 0.7701388888888889 | 0 |
| 0.7708333333333334 | 0 |
| 0.7715277777777777 | 0 |
| 0.7722222222222223 | 0 |
| 0.7729166666666667 | 0 |
| 0.7736111111111111 | 0 |
| 0.7743055555555555 | 0 |
| 0.775 | 0 |
| 0.7756944444444445 | 0 |
| 0.7763888888888889 | 0 |
| 0.7770833333333332 | 0 |
| 0.7777777777777778 | 0 |
| 0.7784722222222222 | 0 |
| 0.7791666666666667 | 0 |
| 0.779861111111111 | 0 |
| 0.7805555555555556 | 0 |
| 0.78125 | 0 |
| 0.7819444444444444 | 0 |
| 0.782638888888889 | 0 |
| 0.7833333333333333 | 0 |
| 0.7840277777777778 | 0 |
| 0.7847222222222222 | 0 |
| 0.7854166666666668 | 0 |
| 0.7861111111111111 | 0 |
| 0.7868055555555555 | 0 |
| 0.7875 | 0 |
| 0.7881944444444445 | 0 |
| 0.7888888888888889 | 0 |
| 0.7895833333333333 | 0 |
| 0.7902777777777777 | 0 |
| 0.7909722222222223 | 0 |
| 0.7916666666666666 | 0 |
| 0.7923611111111111 | 0 |
| 0.7930555555555556 | 0 |
| 0.7937500000000001 | 0 |
| 0.7944444444444444 | 0 |
| 0.7951388888888888 | 0 |
| 0.7958333333333334 | 0 |
| 0.7965277777777778 | 0 |
| 0.7972222222222222 | 0 |
| 0.7979166666666666 | 0 |
| 0.7986111111111112 | 0 |
| 0.7993055555555556 | 0 |
| 0.7999999999999999 | 0 |
| 0.8006944444444444 | 0 |
| 0.8013888888888889 | 0 |
| 0.8020833333333334 | 0 |
| 0.8027777777777777 | 0 |
| 0.8034722222222223 | 0 |
| 0.8041666666666667 | 0 |
| 0.8048611111111111 | 0 |
| 0.8055555555555555 | 0 |
| 0.80625 | 0 |
| 0.8069444444444445 | 0 |
| 0.8076388888888889 | 0 |
| 0.8083333333333332 | 0 |
| 0.8090277777777778 | 0 |
| 0.8097222222222222 | 0 |
| 0.8104166666666667 | 0 |
| 0.811111111111111 | 0 |
| 0.8118055555555556 | 0 |
| 0.8125 | 0 |
| 0.8131944444444444 | 0 |
| 0.813888888888889 | 0 |
| 0.8145833333333333 | 0 |
| 0.8152777777777778 | 0 |
| 0.8159722222222222 | 0 |
| 0.8166666666666668 | 0 |
| 0.8173611111111111 | 0 |
| 0.8180555555555555 | 0 |
| 0.81875 | 0 |
| 0.8194444444444445 | 0 |
| 0.8201388888888889 | 0 |
| 0.8208333333333333 | 0 |
| 0.8215277777777777 | 0 |
| 0.8222222222222223 | 0 |
| 0.8229166666666666 | 0 |
| 0.8236111111111111 | 0 |
| 0.8243055555555556 | 0 |
| 0.8250000000000001 | 0 |
| 0.8256944444444444 | 0 |
| 0.8263888888888888 | 0 |
| 0.8270833333333334 | 0 |
| 0.8277777777777778 | 0 |
| 0.8284722222222222 | 0 |
| 0.8291666666666666 | 0 |
| 0.8298611111111112 | 0 |
| 0.8305555555555556 | 0 |
| 0.8312499999999999 | 0 |
| 0.8319444444444444 | 0 |
| 0.8326388888888889 | 0 |
| 0.8333333333333334 | 0 |
| 0.8340277777777777 | 0 |
| 0.8347222222222223 | 0 |
| 0.8354166666666667 | 0 |
| 0.8361111111111111 | 0 |
| 0.8368055555555555 | 0 |
| 0.8375 | 0 |
| 0.8381944444444445 | 0 |
| 0.8388888888888889 | 0 |
| 0.8395833333333332 | 0 |
| 0.8402777777777778 | 0 |
| 0.8409722222222222 | 0 |
| 0.8416666666666667 | 0 |
| 0.842361111111111 | 0 |
| 0.8430555555555556 | 0 |
| 0.84375 | 0 |
| 0.8444444444444444 | 0 |
| 0.845138888888889 | 0 |
| 0.8458333333333333 | 0 |
| 0.8465277777777778 | 0 |
| 0.8472222222222222 | 0 |
| 0.8479166666666668 | 0 |
| 0.8486111111111111 | 0 |
| 0.8493055555555555 | 0 |
| 0.85 | 0 |
| 0.8506944444444445 | 0 |
| 0.8513888888888889 | 0 |
| 0.8520833333333333 | 0 |
| 0.8527777777777777 | 0 |
| 0.8534722222222223 | 0 |
| 0.8541666666666666 | 0 |
| 0.8548611111111111 | 0 |
| 0.8555555555555556 | 0 |
| 0.8562500000000001 | 0 |
| 0.8569444444444444 | 0 |
| 0.8576388888888888 | 0 |
| 0.8583333333333334 | 0 |
| 0.8590277777777778 | 0 |
| 0.8597222222222222 | 0 |
| 0.8604166666666666 | 0 |
| 0.8611111111111112 | 0 |
| 0.8618055555555556 | 0 |
| 0.8624999999999999 | 0 |
| 0.8631944444444444 | 0 |
| 0.8638888888888889 | 0 |
| 0.8645833333333334 | 0 |
| 0.8652777777777777 | 0 |
| 0.8659722222222223 | 0 |
| 0.8666666666666667 | 0 |
| 0.8673611111111111 | 0 |
| 0.8680555555555555 | 0 |
| 0.86875 | 0 |
| 0.8694444444444445 | 0 |
| 0.8701388888888889 | 0 |
| 0.8708333333333332 | 0 |
| 0.8715277777777778 | 0 |
| 0.8722222222222222 | 0 |
| 0.8729166666666667 | 0 |
| 0.873611111111111 | 0 |
| 0.8743055555555556 | 0 |
| 0.875 | 0 |
| 0.8756944444444444 | 0 |
| 0.876388888888889 | 0 |
| 0.8770833333333333 | 0 |
| 0.8777777777777778 | 0 |
| 0.8784722222222222 | 0 |
| 0.8791666666666668 | 0 |
| 0.8798611111111111 | 0 |
| 0.8805555555555555 | 0 |
| 0.88125 | 0 |
| 0.8819444444444445 | 0 |
| 0.8826388888888889 | 0 |
| 0.8833333333333333 | 0 |
| 0.8840277777777777 | 0 |
| 0.8847222222222223 | 0 |
| 0.8854166666666666 | 0 |
| 0.8861111111111111 | 0 |
| 0.8868055555555556 | 0 |
| 0.8875000000000001 | 0 |
| 0.8881944444444444 | 0 |
| 0.8888888888888888 | 0 |
| 0.8895833333333334 | 0 |
| 0.8902777777777778 | 0 |
| 0.8909722222222222 | 0 |
| 0.8916666666666666 | 0 |
| 0.8923611111111112 | 0 |
| 0.8930555555555556 | 0 |
| 0.8937499999999999 | 0 |
| 0.8944444444444444 | 0 |
| 0.8951388888888889 | 0 |
| 0.8958333333333334 | 0 |
| 0.8965277777777777 | 0 |
| 0.8972222222222223 | 0 |
| 0.8979166666666667 | 0 |
| 0.8986111111111111 | 0 |
| 0.8993055555555555 | 0 |
| 0.9 | 0 |
| 0.9006944444444445 | 0 |
| 0.9013888888888889 | 0 |
| 0.9020833333333332 | 0 |
| 0.9027777777777778 | 0 |
| 0.9034722222222222 | 0 |
| 0.9041666666666667 | 0 |
| 0.904861111111111 | 0 |
| 0.9055555555555556 | 0 |
| 0.90625 | 0 |
| 0.9069444444444444 | 0 |
| 0.907638888888889 | 0 |
| 0.9083333333333333 | 0 |
| 0.9090277777777778 | 0 |
| 0.9097222222222222 | 0 |
| 0.9104166666666668 | 0 |
| 0.9111111111111111 | 0 |
| 0.9118055555555555 | 0 |
| 0.9125 | 0 |
| 0.9131944444444445 | 0 |
| 0.9138888888888889 | 0 |
| 0.9145833333333333 | 0 |
| 0.9152777777777777 | 0 |
| 0.9159722222222223 | 0 |
| 0.9166666666666666 | 0 |
| 0.9173611111111111 | 0 |
| 0.9180555555555556 | 0 |
| 0.9187500000000001 | 0 |
| 0.9194444444444444 | 0 |
| 0.9201388888888888 | 0 |
| 0.9208333333333334 | 0 |
| 0.9215277777777778 | 0 |
| 0.9222222222222222 | 0 |
| 0.9229166666666666 | 0 |
| 0.9236111111111112 | 0 |
| 0.9243055555555556 | 0 |
| 0.9249999999999999 | 0 |
| 0.9256944444444444 | 0 |
| 0.9263888888888889 | 0 |
| 0.9270833333333334 | 0 |
| 0.9277777777777777 | 0 |
| 0.9284722222222223 | 0 |
| 0.9291666666666667 | 0 |
| 0.9298611111111111 | 0 |
| 0.9305555555555555 | 0 |
| 0.93125 | 0 |
| 0.9319444444444445 | 0 |
| 0.9326388888888889 | 0 |
| 0.9333333333333332 | 0 |
| 0.9340277777777778 | 0 |
| 0.9347222222222222 | 0 |
| 0.9354166666666667 | 0 |
| 0.936111111111111 | 0 |
| 0.9368055555555556 | 0 |
| 0.9375 | 0 |
| 0.9381944444444444 | 0 |
| 0.938888888888889 | 0 |
| 0.9395833333333333 | 0 |
| 0.9402777777777778 | 0 |
| 0.9409722222222222 | 0 |
| 0.9416666666666668 | 0 |
| 0.9423611111111111 | 0 |
| 0.9430555555555555 | 0 |
| 0.94375 | 0 |
| 0.9444444444444445 | 0 |
| 0.9451388888888889 | 0 |
| 0.9458333333333333 | 0 |
| 0.9465277777777777 | 0 |
| 0.9472222222222223 | 0 |
| 0.9479166666666666 | 0 |
| 0.9486111111111111 | 0 |
| 0.9493055555555556 | 0 |
| 0.9500000000000001 | 0 |
| 0.9506944444444444 | 0 |
| 0.9513888888888888 | 0 |
| 0.9520833333333334 | 0 |
| 0.9527777777777778 | 0 |
| 0.9534722222222222 | 0 |
| 0.9541666666666666 | 0 |
| 0.9548611111111112 | 0 |
| 0.9555555555555556 | 0 |
| 0.9562499999999999 | 0 |
| 0.9569444444444444 | 0 |
| 0.9576388888888889 | 0 |
| 0.9583333333333334 | 0 |
| 0.9590277777777777 | 0 |
| 0.9597222222222223 | 0 |
| 0.9604166666666667 | 0 |
| 0.9611111111111111 | 0 |
| 0.9618055555555555 | 0 |
| 0.9625 | 0 |
| 0.9631944444444445 | 0 |
| 0.9638888888888889 | 0 |
| 0.9645833333333332 | 0 |
| 0.9652777777777778 | 0 |
| 0.9659722222222222 | 0 |
| 0.9666666666666667 | 0 |
| 0.967361111111111 | 0 |
| 0.9680555555555556 | 0 |
| 0.96875 | 0 |
| 0.9694444444444444 | 0 |
| 0.970138888888889 | 0 |
| 0.9708333333333333 | 0 |
| 0.9715277777777778 | 0 |
| 0.9722222222222222 | 0 |
| 0.9729166666666668 | 0 |
| 0.9736111111111111 | 0 |
| 0.9743055555555555 | 0 |
| 0.975 | 0 |
| 0.9756944444444445 | 0 |
| 0.9763888888888889 | 0 |
| 0.9770833333333333 | 0 |
| 0.9777777777777777 | 0 |
| 0.9784722222222223 | 0 |
| 0.9791666666666666 | 0 |
| 0.9798611111111111 | 0 |
| 0.9805555555555556 | 0 |
| 0.9812500000000001 | 0 |
| 0.9819444444444444 | 0 |
| 0.9826388888888888 | 0 |
| 0.9833333333333334 | 0 |
| 0.9840277777777778 | 0 |
| 0.9847222222222222 | 0 |
| 0.9854166666666666 | 0 |
| 0.9861111111111112 | 0 |
| 0.9868055555555556 | 0 |
| 0.9874999999999999 | 0 |
| 0.9881944444444444 | 0 |
| 0.9888888888888889 | 0 |
| 0.9895833333333334 | 0 |
| 0.9902777777777777 | 0 |
| 0.9909722222222223 | 0 |
| 0.9916666666666667 | 0 |
| 0.9923611111111111 | 0 |
| 0.9930555555555555 | 0 |
| 0.99375 | 0 |
| 0.9944444444444445 | 0 |
| 0.9951388888888889 | 0 |
| 0.9958333333333332 | 0 |
| 0.9965277777777778 | 0 |
| 0.9972222222222222 | 0 |
| 0.9979166666666667 | 0 |
| 0.998611111111111 | 0 |
| 0.9993055555555556 | 0 |